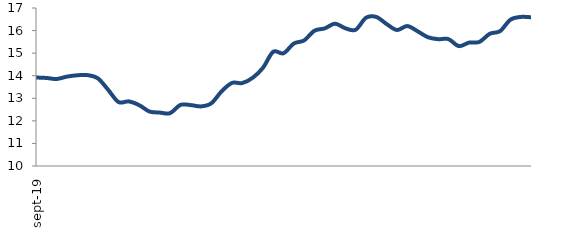
| Category | Series 0 |
|---|---|
| 2019-09-01 | 13.92 |
| 2019-10-01 | 13.901 |
| 2019-11-01 | 13.855 |
| 2019-12-01 | 13.96 |
| 2020-01-01 | 14.019 |
| 2020-02-01 | 14.026 |
| 2020-03-01 | 13.882 |
| 2020-04-01 | 13.374 |
| 2020-05-01 | 12.833 |
| 2020-06-01 | 12.862 |
| 2020-07-01 | 12.698 |
| 2020-08-01 | 12.414 |
| 2020-09-01 | 12.367 |
| 2020-10-01 | 12.342 |
| 2020-11-01 | 12.705 |
| 2020-12-01 | 12.699 |
| 2021-01-01 | 12.641 |
| 2021-02-01 | 12.779 |
| 2021-03-01 | 13.308 |
| 2021-04-01 | 13.679 |
| 2021-05-01 | 13.675 |
| 2021-06-01 | 13.905 |
| 2021-07-01 | 14.345 |
| 2021-08-01 | 15.059 |
| 2021-09-01 | 14.995 |
| 2021-10-01 | 15.427 |
| 2021-11-01 | 15.564 |
| 2021-12-01 | 15.993 |
| 2022-01-01 | 16.097 |
| 2022-02-01 | 16.304 |
| 2022-03-01 | 16.101 |
| 2022-04-01 | 16.037 |
| 2022-05-01 | 16.568 |
| 2022-06-01 | 16.602 |
| 2022-07-01 | 16.29 |
| 2022-08-01 | 16.026 |
| 2022-09-01 | 16.201 |
| 2022-10-01 | 15.97 |
| 2022-11-01 | 15.706 |
| 2022-12-01 | 15.62 |
| 2023-01-01 | 15.621 |
| 2023-02-01 | 15.312 |
| 2023-03-01 | 15.467 |
| 2023-04-01 | 15.498 |
| 2023-05-01 | 15.858 |
| 2023-06-01 | 15.975 |
| 2023-07-01 | 16.48 |
| 2023-08-01 | 16.604 |
| 2023-09-01 | 16.589 |